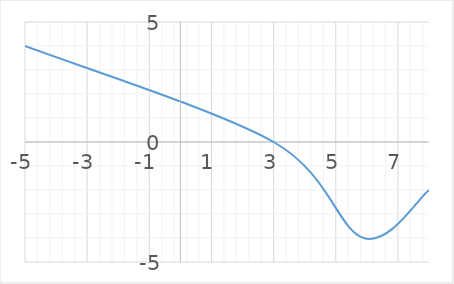
| Category | Series 0 |
|---|---|
| -5.0 | 4 |
| 3.0 | 0 |
| 5.9 | -4 |
| 8.0 | -2 |